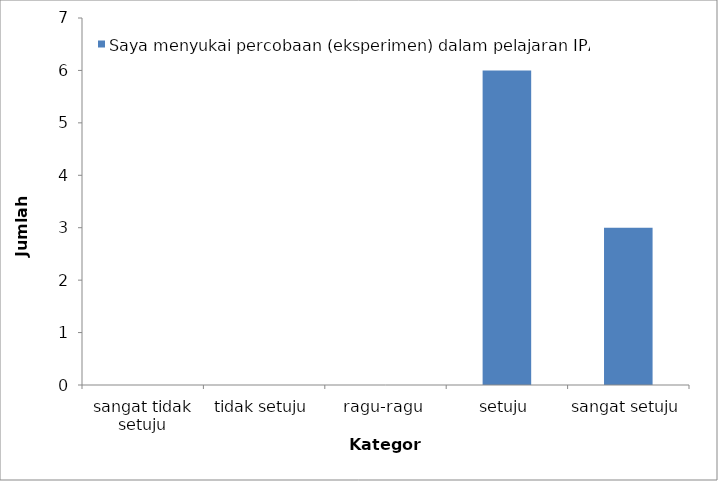
| Category | Saya menyukai percobaan (eksperimen) dalam pelajaran IPA |
|---|---|
| sangat tidak setuju | 0 |
| tidak setuju | 0 |
| ragu-ragu | 0 |
| setuju | 6 |
| sangat setuju | 3 |